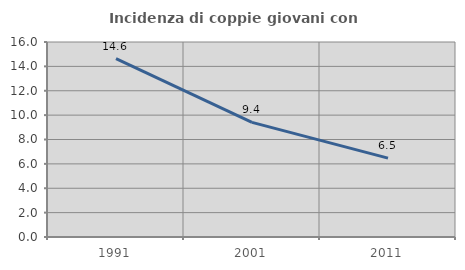
| Category | Incidenza di coppie giovani con figli |
|---|---|
| 1991.0 | 14.643 |
| 2001.0 | 9.404 |
| 2011.0 | 6.471 |